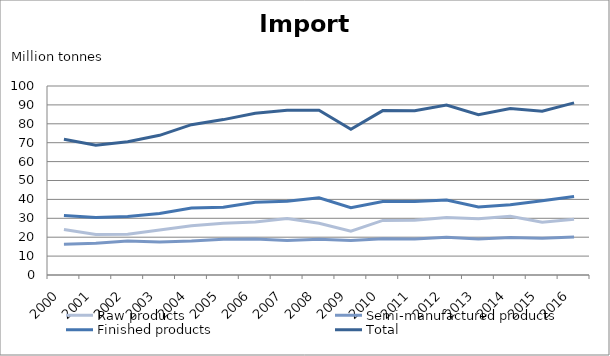
| Category | Raw products | Semi-manufactured products | Finished products | Total |
|---|---|---|---|---|
| 2000.0 | 24.092 | 16.259 | 31.435 | 71.786 |
| 2001.0 | 21.458 | 16.744 | 30.44 | 68.642 |
| 2002.0 | 21.553 | 17.952 | 30.983 | 70.488 |
| 2003.0 | 23.794 | 17.523 | 32.59 | 73.906 |
| 2004.0 | 26.099 | 18.01 | 35.421 | 79.53 |
| 2005.0 | 27.44 | 18.905 | 35.877 | 82.222 |
| 2006.0 | 28.008 | 19.074 | 38.469 | 85.551 |
| 2007.0 | 29.901 | 18.267 | 38.976 | 87.144 |
| 2008.0 | 27.364 | 18.951 | 40.893 | 87.208 |
| 2009.0 | 23.233 | 18.287 | 35.626 | 77.145 |
| 2010.0 | 28.899 | 19.203 | 38.89 | 86.992 |
| 2011.0 | 28.913 | 19.112 | 38.848 | 86.873 |
| 2012.0 | 30.4 | 19.907 | 39.63 | 89.938 |
| 2013.0 | 29.709 | 19.106 | 35.945 | 84.76 |
| 2014.0 | 31.1 | 19.806 | 37.203 | 88.109 |
| 2015.0 | 27.91 | 19.502 | 39.273 | 86.686 |
| 2016.0 | 29.44 | 20.124 | 41.517 | 91.081 |